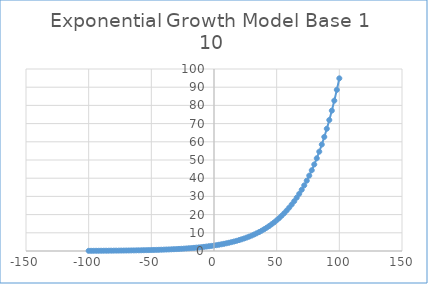
| Category | Series 0 |
|---|---|
| -100.0 | 0.095 |
| -98.0 | 0.102 |
| -96.0 | 0.109 |
| -94.0 | 0.117 |
| -92.0 | 0.125 |
| -90.0 | 0.134 |
| -88.0 | 0.144 |
| -86.0 | 0.154 |
| -84.0 | 0.165 |
| -82.0 | 0.177 |
| -80.0 | 0.189 |
| -78.0 | 0.203 |
| -76.0 | 0.217 |
| -74.0 | 0.233 |
| -72.0 | 0.25 |
| -70.0 | 0.267 |
| -68.0 | 0.286 |
| -66.0 | 0.307 |
| -64.0 | 0.329 |
| -62.0 | 0.352 |
| -60.0 | 0.378 |
| -58.0 | 0.405 |
| -56.0 | 0.434 |
| -54.0 | 0.465 |
| -52.0 | 0.498 |
| -50.0 | 0.533 |
| -48.0 | 0.572 |
| -46.0 | 0.613 |
| -44.0 | 0.656 |
| -42.0 | 0.703 |
| -40.0 | 0.754 |
| -38.0 | 0.807 |
| -36.0 | 0.865 |
| -34.0 | 0.927 |
| -32.0 | 0.993 |
| -30.0 | 1.064 |
| -28.0 | 1.141 |
| -26.0 | 1.222 |
| -24.0 | 1.31 |
| -22.0 | 1.403 |
| -20.0 | 1.504 |
| -18.0 | 1.611 |
| -16.0 | 1.726 |
| -14.0 | 1.85 |
| -12.0 | 1.982 |
| -10.0 | 2.124 |
| -8.0 | 2.276 |
| -6.0 | 2.438 |
| -4.0 | 2.613 |
| -2.0 | 2.8 |
| 0.0 | 3 |
| 2.0 | 3.215 |
| 4.0 | 3.444 |
| 6.0 | 3.691 |
| 8.0 | 3.955 |
| 10.0 | 4.238 |
| 12.0 | 4.541 |
| 14.0 | 4.865 |
| 16.0 | 5.213 |
| 18.0 | 5.586 |
| 20.0 | 5.986 |
| 22.0 | 6.414 |
| 24.0 | 6.873 |
| 26.0 | 7.364 |
| 28.0 | 7.891 |
| 30.0 | 8.455 |
| 32.0 | 9.06 |
| 34.0 | 9.708 |
| 36.0 | 10.402 |
| 38.0 | 11.146 |
| 40.0 | 11.943 |
| 42.0 | 12.797 |
| 44.0 | 13.713 |
| 46.0 | 14.693 |
| 48.0 | 15.744 |
| 50.0 | 16.87 |
| 52.0 | 18.077 |
| 54.0 | 19.37 |
| 56.0 | 20.755 |
| 58.0 | 22.239 |
| 60.0 | 23.83 |
| 62.0 | 25.534 |
| 64.0 | 27.36 |
| 66.0 | 29.317 |
| 68.0 | 31.414 |
| 70.0 | 33.661 |
| 72.0 | 36.068 |
| 74.0 | 38.647 |
| 76.0 | 41.412 |
| 78.0 | 44.373 |
| 80.0 | 47.547 |
| 82.0 | 50.947 |
| 84.0 | 54.591 |
| 86.0 | 58.495 |
| 88.0 | 62.679 |
| 90.0 | 67.162 |
| 92.0 | 71.965 |
| 94.0 | 77.112 |
| 96.0 | 82.627 |
| 98.0 | 88.536 |
| 100.0 | 94.868 |